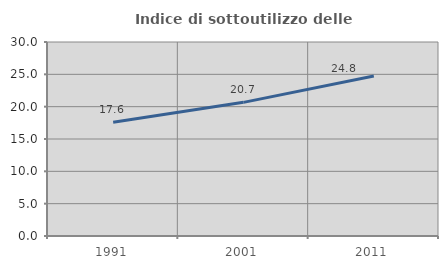
| Category | Indice di sottoutilizzo delle abitazioni  |
|---|---|
| 1991.0 | 17.584 |
| 2001.0 | 20.668 |
| 2011.0 | 24.754 |